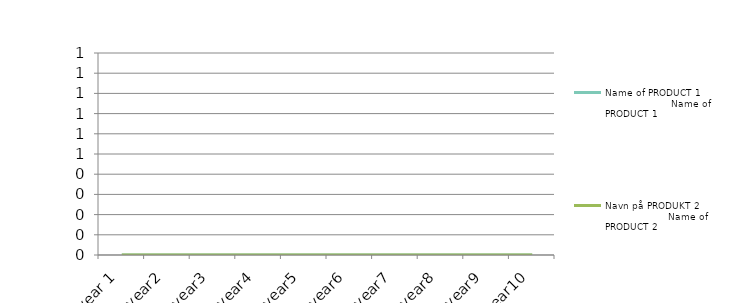
| Category | Name of PRODUCT 1 Name of PRODUCT 1 | Navn på PRODUKT 2 Name of PRODUCT 2 | Navn på PRODUKT 3 | Navn på PRODUKT 4 | Navn på PRODUKT 5 | Navn på PRODUKT 6 | Navn på PRODUKT 7 | Navn på PRODUKT 8 |
|---|---|---|---|---|---|---|---|---|
| year 1 | 0 | 0 |  |  |  |  |  |  |
| year2 | 0 | 0 |  |  |  |  |  |  |
| year3 | 0 | 0 |  |  |  |  |  |  |
| year4 | 0 | 0 |  |  |  |  |  |  |
| year5 | 0 | 0 |  |  |  |  |  |  |
| year6 | 0 | 0 |  |  |  |  |  |  |
| year7 | 0 | 0 |  |  |  |  |  |  |
| year8 | 0 | 0 |  |  |  |  |  |  |
| year9 | 0 | 0 |  |  |  |  |  |  |
| year10 | 0 | 0 |  |  |  |  |  |  |